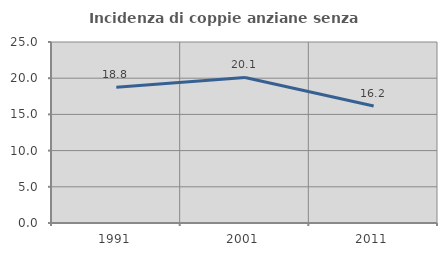
| Category | Incidenza di coppie anziane senza figli  |
|---|---|
| 1991.0 | 18.75 |
| 2001.0 | 20.107 |
| 2011.0 | 16.164 |